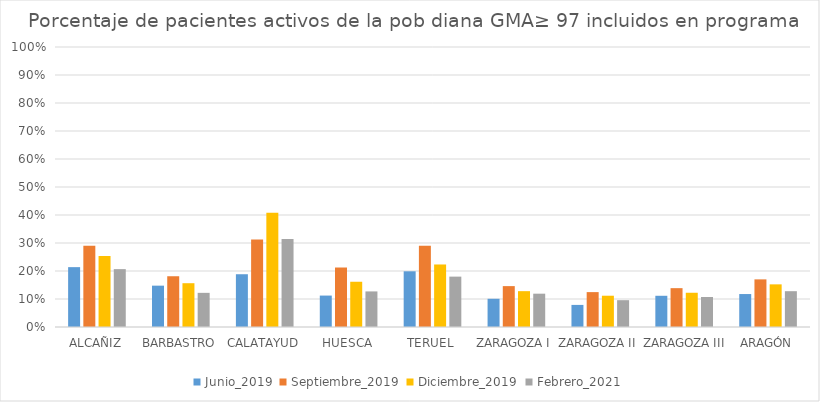
| Category | Junio_2019 | Septiembre_2019 | Diciembre_2019 | Febrero_2021 |
|---|---|---|---|---|
| ALCAÑIZ | 0.214 | 0.29 | 0.254 | 0.207 |
| BARBASTRO | 0.148 | 0.181 | 0.156 | 0.122 |
| CALATAYUD | 0.188 | 0.312 | 0.408 | 0.314 |
| HUESCA | 0.112 | 0.212 | 0.162 | 0.127 |
| TERUEL | 0.199 | 0.291 | 0.223 | 0.18 |
| ZARAGOZA I | 0.101 | 0.146 | 0.128 | 0.119 |
| ZARAGOZA II | 0.079 | 0.125 | 0.112 | 0.096 |
| ZARAGOZA III | 0.112 | 0.139 | 0.122 | 0.107 |
| ARAGÓN | 0.118 | 0.17 | 0.152 | 0.128 |